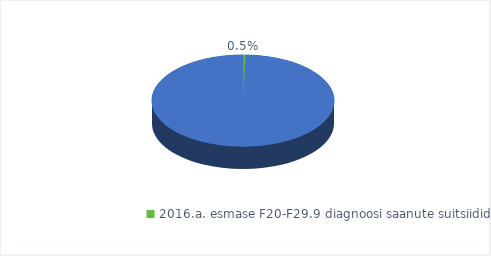
| Category | 2016.a. esmase F20-F29.9 diagnoosi saanute suitsiidid esimese aasta jooksul peale diagnoosi saamist, osakaal |
|---|---|
| 2016.a. esmase F20-F29.9 diagnoosi saanute suitsiidid esimese aasta jooksul peale diagnoosi saamist, osakaal | 0.005 |